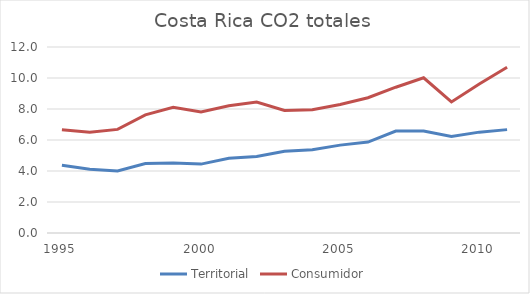
| Category | Territorial | Consumidor |
|---|---|---|
| 1995.0 | 4.369 | 6.663 |
| 1996.0 | 4.107 | 6.496 |
| 1997.0 | 4.005 | 6.686 |
| 1998.0 | 4.481 | 7.619 |
| 1999.0 | 4.518 | 8.107 |
| 2000.0 | 4.444 | 7.814 |
| 2001.0 | 4.827 | 8.204 |
| 2002.0 | 4.932 | 8.453 |
| 2003.0 | 5.269 | 7.903 |
| 2004.0 | 5.372 | 7.952 |
| 2005.0 | 5.67 | 8.288 |
| 2006.0 | 5.865 | 8.726 |
| 2007.0 | 6.581 | 9.406 |
| 2008.0 | 6.578 | 10.014 |
| 2009.0 | 6.221 | 8.455 |
| 2010.0 | 6.507 | 9.618 |
| 2011.0 | 6.669 | 10.693 |